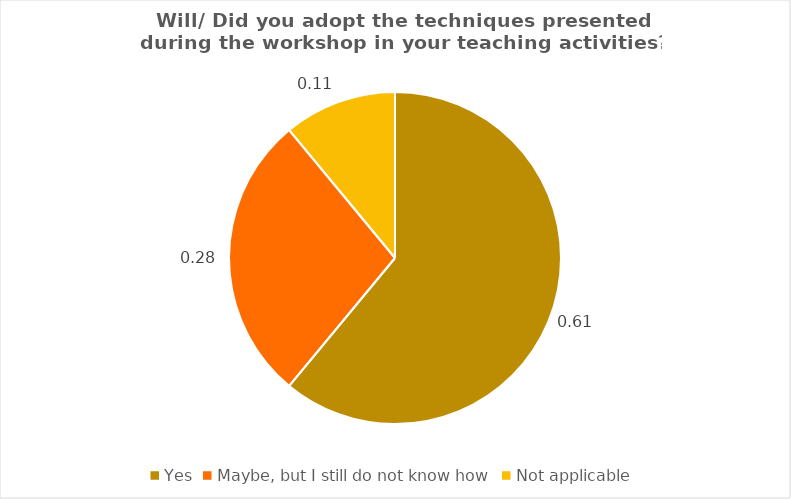
| Category | Series 0 |
|---|---|
| Yes  | 0.61 |
| Maybe, but I still do not know how  | 0.28 |
| Not applicable | 0.11 |